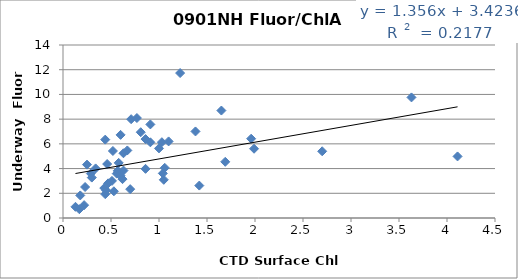
| Category | Fluor |
|---|---|
| 1.03 | 6.135 |
| 1.99 | 5.605 |
| 0.86 | 3.978 |
| 1.05 | 3.091 |
| 0.62 | 3.145 |
| 1.0 | 5.634 |
| 0.58 | 4.462 |
| 0.6 | 3.413 |
| 0.44 | 1.929 |
| 0.23 | 2.508 |
| 0.22 | 1.041 |
| 0.34 | 4.013 |
| 0.43 | 2.423 |
| 0.46 | 4.368 |
| 0.91 | 7.574 |
| 0.81 | 6.941 |
| 1.04 | 3.611 |
| 0.53 | 2.162 |
| 0.63 | 3.841 |
| 0.45 | 2.234 |
| 1.69 | 4.547 |
| 3.63 | 9.759 |
| 0.47 | 2.804 |
| 1.1 | 6.198 |
| 1.38 | 7.005 |
| 0.7 | 2.333 |
| 0.18 | 1.826 |
| 0.52 | 5.422 |
| 0.17 | 0.713 |
| 0.77 | 8.091 |
| 1.22 | 11.73 |
| 0.67 | 5.467 |
| 0.56 | 3.59 |
| 0.71 | 7.997 |
| 1.65 | 8.696 |
| 4.11 | 4.982 |
| 1.96 | 6.417 |
| 0.51 | 3.002 |
| 0.25 | 4.319 |
| 1.42 | 2.624 |
| 0.63 | 5.238 |
| 0.57 | 3.818 |
| 0.29 | 3.599 |
| 0.44 | 6.342 |
| 0.6 | 6.727 |
| 0.13 | 0.906 |
| 0.3 | 3.27 |
| 0.86 | 6.386 |
| 1.06 | 4.058 |
| 0.91 | 6.125 |
| 2.7 | 5.398 |